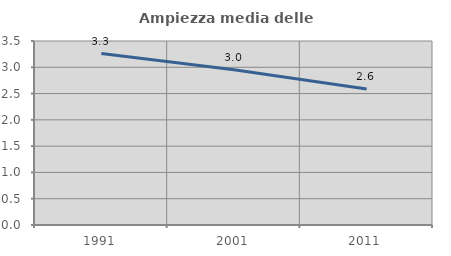
| Category | Ampiezza media delle famiglie |
|---|---|
| 1991.0 | 3.261 |
| 2001.0 | 2.954 |
| 2011.0 | 2.587 |